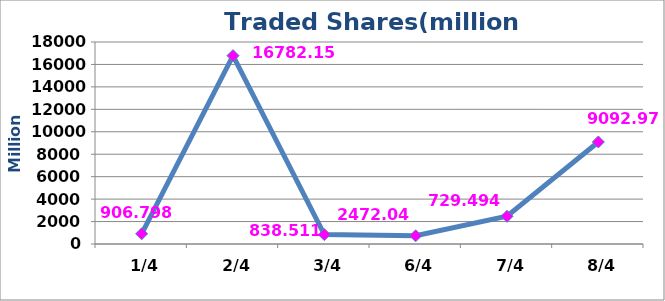
| Category | عدد الاسهم |
|---|---|
|  1/4 | 906798370 |
|  2/4 | 16782153574 |
|  3/4 | 838510985 |
|  6/4 | 729494113 |
|  7/4 | 2472045597 |
|  8/4 | 9092977650 |